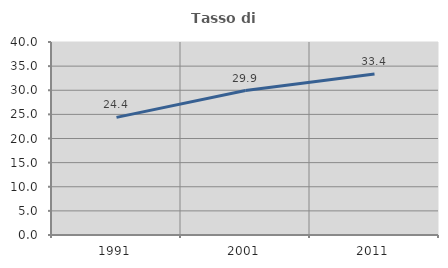
| Category | Tasso di occupazione   |
|---|---|
| 1991.0 | 24.38 |
| 2001.0 | 29.929 |
| 2011.0 | 33.36 |